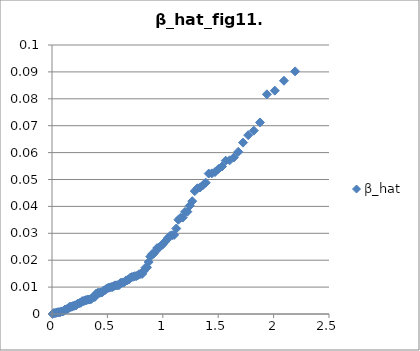
| Category | β_hat |
|---|---|
| 2.1941335988905526 | 0.09 |
| 2.0936595062951366 | 0.087 |
| 2.0107219073844607 | 0.083 |
| 1.9396737242152815 | 0.082 |
| 1.8772497561695543 | 0.071 |
| 1.8213847801230927 | 0.068 |
| 1.7706861719455724 | 0.066 |
| 1.7241685529776052 | 0.064 |
| 1.681108016975268 | 0.06 |
| 1.640956469625396 | 0.058 |
| 1.6032885295156099 | 0.057 |
| 1.5677671502423158 | 0.057 |
| 1.5341205443525465 | 0.055 |
| 1.5021262136956048 | 0.054 |
| 1.471599605176274 | 0.053 |
| 1.442385867763244 | 0.052 |
| 1.4143537431646485 | 0.052 |
| 1.3873909580680261 | 0.049 |
| 1.3614006944748038 | 0.048 |
| 1.3362988480226936 | 0.047 |
| 1.3120118715480227 | 0.047 |
| 1.2884750596291885 | 0.046 |
| 1.2656311697916718 | 0.042 |
| 1.243429303818069 | 0.04 |
| 1.2218239922212495 | 0.038 |
| 1.2007744390034392 | 0.038 |
| 1.180243894047243 | 0.036 |
| 1.1601991280091581 | 0.036 |
| 1.140609990188963 | 0.035 |
| 1.1214490340650125 | 0.032 |
| 1.102691198390971 | 0.029 |
| 1.0843135342087662 | 0.029 |
| 1.0662949700359918 | 0.029 |
| 1.0486161089710224 | 0.028 |
| 1.0312590526267622 | 0.027 |
| 1.0142072477285224 | 0.027 |
| 0.9974453519485859 | 0.026 |
| 0.980959116141547 | 0.025 |
| 0.9647352806217081 | 0.025 |
| 0.9487614835114762 | 0.024 |
| 0.9330261795058971 | 0.023 |
| 0.9175185676579484 | 0.022 |
| 0.9022285270031009 | 0.022 |
| 0.8871465590188761 | 0.021 |
| 0.8722637360623874 | 0.019 |
| 0.85757165505207 | 0.017 |
| 0.8430623957630117 | 0.017 |
| 0.8287284831922679 | 0.016 |
| 0.8145628535240322 | 0.015 |
| 0.8005588232868396 | 0.015 |
| 0.7867100613480268 | 0.015 |
| 0.7730105634359591 | 0.014 |
| 0.759454628919302 | 0.014 |
| 0.7460368396059255 | 0.014 |
| 0.7327520403527368 | 0.014 |
| 0.7195953213025243 | 0.014 |
| 0.7065620015853495 | 0.014 |
| 0.6936476143407155 | 0.013 |
| 0.6808478929329188 | 0.013 |
| 0.6681587582462173 | 0.012 |
| 0.6555763069587857 | 0.012 |
| 0.643096800705343 | 0.012 |
| 0.6307166560478383 | 0.012 |
| 0.6184324351820278 | 0.012 |
| 0.60624083731514 | 0.011 |
| 0.5941386906564383 | 0.011 |
| 0.5821229449682337 | 0.011 |
| 0.5701906646300992 | 0.011 |
| 0.5583390221735804 | 0.01 |
| 0.5465652922487938 | 0.01 |
| 0.5348668459879236 | 0.01 |
| 0.5232411457338848 | 0.01 |
| 0.5116857401053212 | 0.01 |
| 0.5001982593717079 | 0.01 |
| 0.4887764111146694 | 0.009 |
| 0.47741797615372 | 0.009 |
| 0.4661208047165216 | 0.009 |
| 0.4548828128354641 | 0.008 |
| 0.4437019789539003 | 0.008 |
| 0.4325763407267638 | 0.008 |
| 0.4215039920015504 | 0.008 |
| 0.4104830799667825 | 0.008 |
| 0.39951180245610823 | 0.008 |
| 0.38858840539712125 | 0.006 |
| 0.37771118039484214 | 0.006 |
| 0.3668784624405738 | 0.006 |
| 0.3560886277375486 | 0.006 |
| 0.34534009163542995 | 0.005 |
| 0.33463130666631574 | 0.005 |
| 0.3239607606754233 | 0.005 |
| 0.3133269750401387 | 0.005 |
| 0.30272850297153525 | 0.005 |
| 0.29216392789290946 | 0.005 |
| 0.28163186189022293 | 0.005 |
| 0.2711309442297125 | 0.005 |
| 0.2606598399382271 | 0.004 |
| 0.25021723844214694 | 0.004 |
| 0.2398018522610058 | 0.004 |
| 0.22941241575217935 | 0.004 |
| 0.2190476839032269 | 0.003 |
| 0.20870643116868118 | 0.003 |
| 0.19838745034826696 | 0.003 |
| 0.1880895515037049 | 0.003 |
| 0.1778115609114148 | 0.003 |
| 0.16755232004858078 | 0.003 |
| 0.1573106846101707 | 0.003 |
| 0.14708552355463042 | 0.002 |
| 0.13687571817608066 | 0.002 |
| 0.12668016120095024 | 0.002 |
| 0.11649775590707183 | 0.002 |
| 0.1063274152633511 | 0.001 |
| 0.09616806108819838 | 0.001 |
| 0.08601862322498113 | 0.001 |
| 0.0758780387328182 | 0.001 |
| 0.06574525109109347 | 0.001 |
| 0.05561920941611599 | 0.001 |
| 0.04549886768839762 | 0.001 |
| 0.03538318398905752 | 0 |
| 0.025271119743895117 | 0 |
| 0.015161638973700734 | 0 |
| 0.0050537075493949975 | 0 |